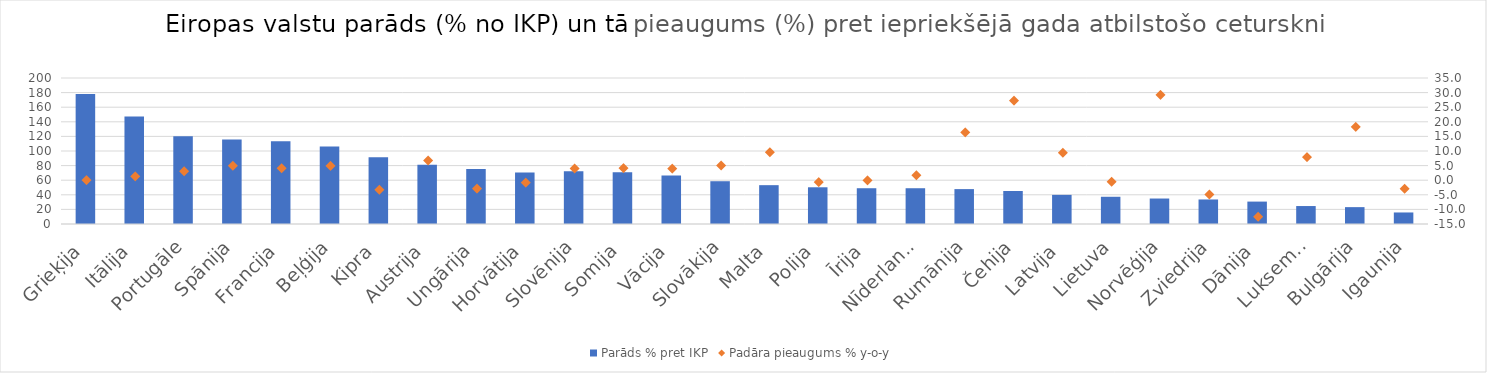
| Category | Parāds % pret IKP |
|---|---|
| Grieķija | 178.2 |
| Itālija | 147.3 |
| Portugāle | 120.1 |
| Spānija | 115.6 |
| Francija | 113.4 |
|  Beļģija | 106.3 |
| Kipra | 91.6 |
| Austrija | 81.3 |
| Ungārija | 75.3 |
| Horvātija | 70.4 |
| Slovēnija | 72.3 |
| Somija | 70.8 |
| Vācija | 66.6 |
| Slovākija | 58.6 |
| Malta | 53.2 |
| Polija | 50.3 |
| Īrija | 49 |
| Nīderlande | 49 |
| Rumānija | 47.8 |
| Čehija | 45.2 |
| Latvija | 39.9 |
| Lietuva | 37.3 |
| Norvēģija | 34.9 |
| Zviedrija | 33.6 |
| Dānija | 30.7 |
| Luksemburga | 24.6 |
| Bulgārija | 23.1 |
| Igaunija | 15.8 |